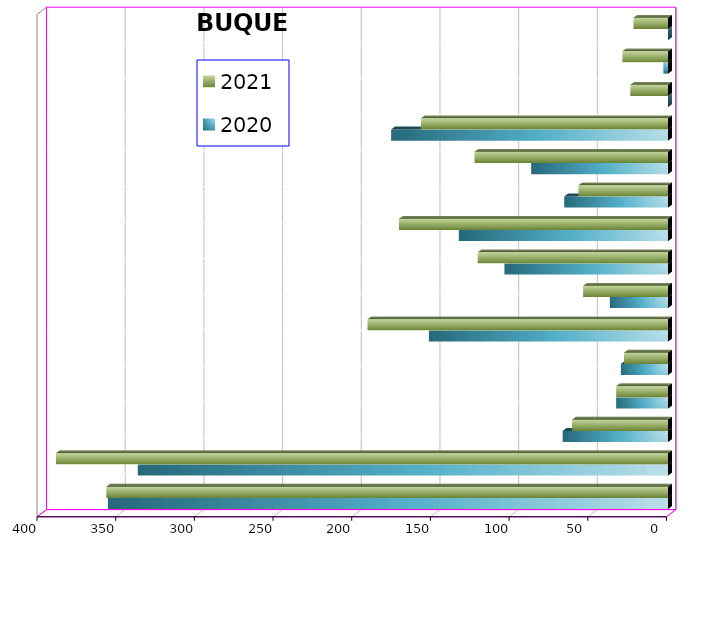
| Category | 2020 | 2021 |
|---|---|---|
| ICAVE | 356 | 357 |
| CICE | 337 | 389 |
| T. C. E. | 67 | 61 |
| CARGILL | 33 | 33 |
| TMV | 30 | 28 |
| SSA | 152 | 191 |
| SEPSA | 37 | 54 |
| VOPAK | 104 | 121 |
| CPV | 133 | 171 |
| EXCELLENCE | 66 | 57 |
| SIPPB | 87 | 123 |
| PEMEX | 176 | 157 |
| PETRA | 0 | 24 |
| OPEVER | 3 | 29 |
| ESJ ERNOVABLE III | 0 | 22 |